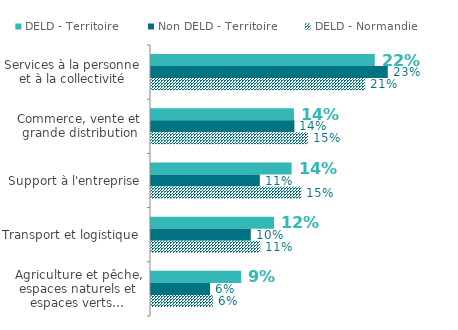
| Category | DELD - Territoire | Non DELD - Territoire | DELD - Normandie |
|---|---|---|---|
| Services à la personne et à la collectivité | 0.219 | 0.231 | 0.209 |
| Commerce, vente et grande distribution | 0.14 | 0.14 | 0.153 |
| Support à l'entreprise | 0.137 | 0.106 | 0.147 |
| Transport et logistique | 0.12 | 0.097 | 0.107 |
| Agriculture et pêche, espaces naturels et espaces verts… | 0.088 | 0.058 | 0.06 |